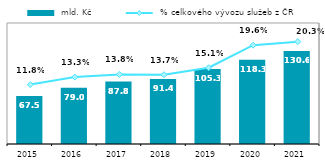
| Category |  mld. Kč |
|---|---|
| 2015.0 | 67.463 |
| 2016.0 | 79.004 |
| 2017.0 | 87.808 |
| 2018.0 | 91.441 |
| 2019.0 | 105.286 |
| 2020.0 | 118.327 |
| 2021.0 | 130.626 |